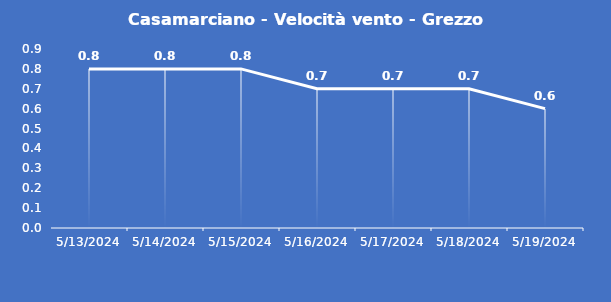
| Category | Casamarciano - Velocità vento - Grezzo (m/s) |
|---|---|
| 5/13/24 | 0.8 |
| 5/14/24 | 0.8 |
| 5/15/24 | 0.8 |
| 5/16/24 | 0.7 |
| 5/17/24 | 0.7 |
| 5/18/24 | 0.7 |
| 5/19/24 | 0.6 |